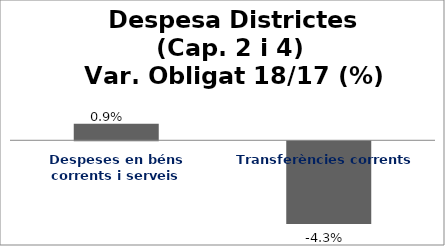
| Category | Series 0 |
|---|---|
| Despeses en béns corrents i serveis | 0.009 |
| Transferències corrents | -0.043 |